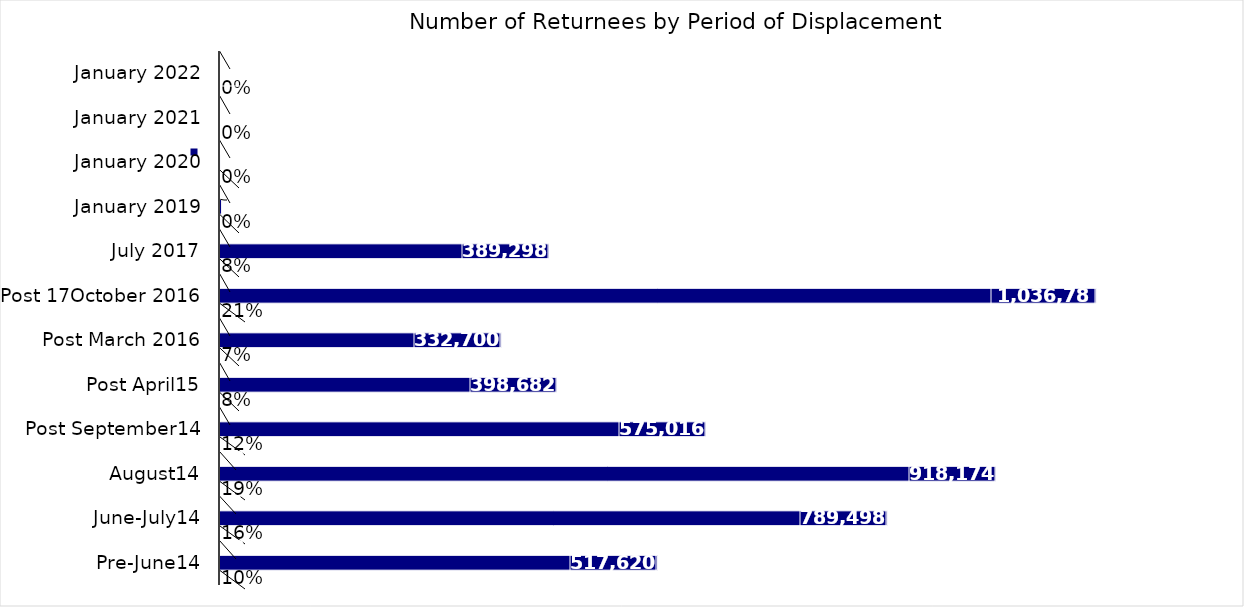
| Category | Sum of % | Sum of Returnees Individuals  | Sum of rank |
|---|---|---|---|
| Pre-June14 | 0.104 | 517620 | 12 |
| June-July14 | 0.159 | 789498 | 11 |
| August14 | 0.185 | 918174 | 10 |
| Post September14 | 0.116 | 575016 | 9 |
| Post April15 | 0.08 | 398682 | 8 |
| Post March 2016 | 0.067 | 332700 | 7 |
| Post 17October 2016 | 0.209 | 1036782 | 6 |
| July 2017 | 0.078 | 389298 | 5 |
| January 2019 | 0 | 1890 | 4 |
| January 2020 | 0 | 54 | 3 |
| January 2021 | 0 | 0 | 2 |
| January 2022 | 0 | 0 | 1 |